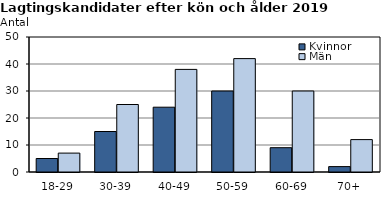
| Category | Kvinnor | Män |
|---|---|---|
| 18-29 | 5 | 7 |
| 30-39 | 15 | 25 |
| 40-49 | 24 | 38 |
| 50-59 | 30 | 42 |
| 60-69 | 9 | 30 |
| 70+ | 2 | 12 |